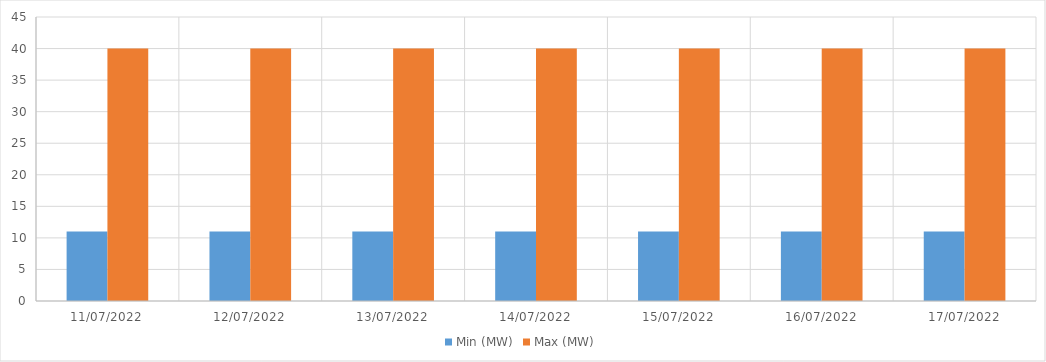
| Category | Min (MW) | Max (MW) |
|---|---|---|
| 11/07/2022 | 11 | 40 |
| 12/07/2022 | 11 | 40 |
| 13/07/2022 | 11 | 40 |
| 14/07/2022 | 11 | 40 |
| 15/07/2022 | 11 | 40 |
| 16/07/2022 | 11 | 40 |
| 17/07/2022 | 11 | 40 |